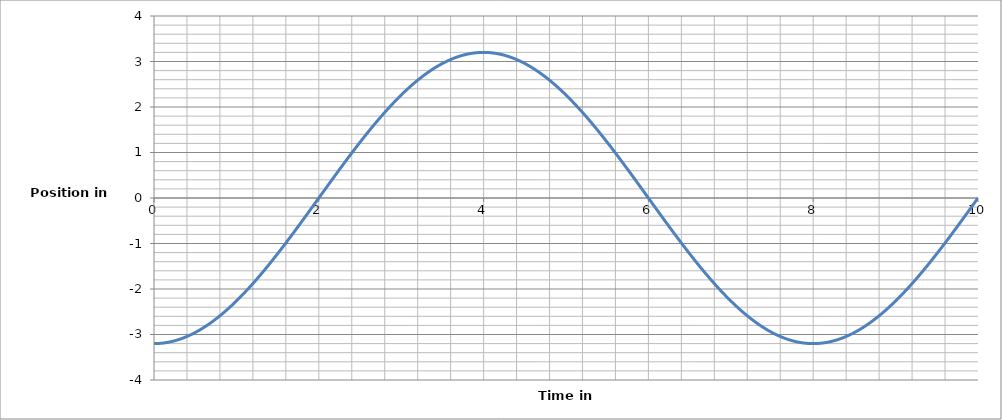
| Category | Series 0 |
|---|---|
| 0.0 | -3.2 |
| 0.01 | -3.2 |
| 0.02 | -3.2 |
| 0.03 | -3.199 |
| 0.04 | -3.198 |
| 0.05 | -3.198 |
| 0.06 | -3.196 |
| 0.07 | -3.195 |
| 0.08 | -3.194 |
| 0.09 | -3.192 |
| 0.1 | -3.19 |
| 0.11 | -3.188 |
| 0.12 | -3.186 |
| 0.13 | -3.183 |
| 0.14 | -3.181 |
| 0.15 | -3.178 |
| 0.16 | -3.175 |
| 0.17 | -3.172 |
| 0.18 | -3.168 |
| 0.19 | -3.164 |
| 0.2 | -3.161 |
| 0.21 | -3.157 |
| 0.22 | -3.152 |
| 0.23 | -3.148 |
| 0.24 | -3.143 |
| 0.25 | -3.139 |
| 0.26 | -3.134 |
| 0.27 | -3.128 |
| 0.28 | -3.123 |
| 0.29 | -3.117 |
| 0.3 | -3.112 |
| 0.31 | -3.106 |
| 0.32 | -3.099 |
| 0.33 | -3.093 |
| 0.34 | -3.087 |
| 0.35 | -3.08 |
| 0.36 | -3.073 |
| 0.37 | -3.066 |
| 0.38 | -3.059 |
| 0.39 | -3.051 |
| 0.4 | -3.043 |
| 0.41 | -3.036 |
| 0.42 | -3.027 |
| 0.43 | -3.019 |
| 0.44 | -3.011 |
| 0.45 | -3.002 |
| 0.46 | -2.993 |
| 0.47 | -2.984 |
| 0.48 | -2.975 |
| 0.49 | -2.966 |
| 0.5 | -2.956 |
| 0.51 | -2.947 |
| 0.52 | -2.937 |
| 0.53 | -2.927 |
| 0.54 | -2.916 |
| 0.55 | -2.906 |
| 0.56 | -2.895 |
| 0.57 | -2.885 |
| 0.58 | -2.874 |
| 0.59 | -2.863 |
| 0.6 | -2.851 |
| 0.61 | -2.84 |
| 0.62 | -2.828 |
| 0.63 | -2.816 |
| 0.64 | -2.804 |
| 0.65 | -2.792 |
| 0.66 | -2.78 |
| 0.67 | -2.767 |
| 0.68 | -2.754 |
| 0.69 | -2.741 |
| 0.7 | -2.728 |
| 0.71 | -2.715 |
| 0.72 | -2.702 |
| 0.73 | -2.688 |
| 0.74 | -2.675 |
| 0.75 | -2.661 |
| 0.76 | -2.647 |
| 0.77 | -2.632 |
| 0.78 | -2.618 |
| 0.79 | -2.604 |
| 0.8 | -2.589 |
| 0.81 | -2.574 |
| 0.82 | -2.559 |
| 0.83 | -2.544 |
| 0.84 | -2.528 |
| 0.85 | -2.513 |
| 0.86 | -2.497 |
| 0.87 | -2.482 |
| 0.88 | -2.466 |
| 0.89 | -2.45 |
| 0.9 | -2.433 |
| 0.91 | -2.417 |
| 0.92 | -2.4 |
| 0.93 | -2.384 |
| 0.94 | -2.367 |
| 0.95 | -2.35 |
| 0.96 | -2.333 |
| 0.97 | -2.315 |
| 0.98 | -2.298 |
| 0.99 | -2.28 |
| 1.0 | -2.263 |
| 1.01 | -2.245 |
| 1.02 | -2.227 |
| 1.03 | -2.209 |
| 1.04 | -2.191 |
| 1.05 | -2.172 |
| 1.06 | -2.154 |
| 1.07 | -2.135 |
| 1.08 | -2.116 |
| 1.09 | -2.097 |
| 1.1 | -2.078 |
| 1.11 | -2.059 |
| 1.12 | -2.04 |
| 1.13 | -2.02 |
| 1.14 | -2.001 |
| 1.15 | -1.981 |
| 1.16 | -1.961 |
| 1.17 | -1.941 |
| 1.18 | -1.921 |
| 1.19 | -1.901 |
| 1.2 | -1.881 |
| 1.21 | -1.861 |
| 1.22 | -1.84 |
| 1.23 | -1.819 |
| 1.24 | -1.799 |
| 1.25 | -1.778 |
| 1.26 | -1.757 |
| 1.27 | -1.736 |
| 1.28 | -1.715 |
| 1.29 | -1.693 |
| 1.3 | -1.672 |
| 1.31 | -1.651 |
| 1.32 | -1.629 |
| 1.33 | -1.607 |
| 1.34 | -1.585 |
| 1.35 | -1.564 |
| 1.36 | -1.542 |
| 1.37 | -1.52 |
| 1.38 | -1.497 |
| 1.39 | -1.475 |
| 1.4 | -1.453 |
| 1.41 | -1.43 |
| 1.42 | -1.408 |
| 1.43 | -1.385 |
| 1.44 | -1.362 |
| 1.45 | -1.34 |
| 1.46 | -1.317 |
| 1.47 | -1.294 |
| 1.48 | -1.271 |
| 1.49 | -1.248 |
| 1.5 | -1.225 |
| 1.51 | -1.201 |
| 1.52 | -1.178 |
| 1.53 | -1.155 |
| 1.54 | -1.131 |
| 1.55 | -1.108 |
| 1.56 | -1.084 |
| 1.57 | -1.06 |
| 1.58 | -1.037 |
| 1.59 | -1.013 |
| 1.6 | -0.989 |
| 1.61 | -0.965 |
| 1.62 | -0.941 |
| 1.63 | -0.917 |
| 1.64 | -0.893 |
| 1.65 | -0.869 |
| 1.66 | -0.844 |
| 1.67 | -0.82 |
| 1.68 | -0.796 |
| 1.69 | -0.771 |
| 1.7 | -0.747 |
| 1.71 | -0.723 |
| 1.72 | -0.698 |
| 1.73 | -0.674 |
| 1.74 | -0.649 |
| 1.75 | -0.624 |
| 1.76 | -0.6 |
| 1.77 | -0.575 |
| 1.78 | -0.55 |
| 1.79 | -0.525 |
| 1.8 | -0.501 |
| 1.81 | -0.476 |
| 1.82 | -0.451 |
| 1.83 | -0.426 |
| 1.84 | -0.401 |
| 1.85 | -0.376 |
| 1.86 | -0.351 |
| 1.87 | -0.326 |
| 1.88 | -0.301 |
| 1.89 | -0.276 |
| 1.9 | -0.251 |
| 1.91 | -0.226 |
| 1.92 | -0.201 |
| 1.93 | -0.176 |
| 1.94 | -0.151 |
| 1.95 | -0.126 |
| 1.96 | -0.101 |
| 1.97 | -0.075 |
| 1.98 | -0.05 |
| 1.99 | -0.025 |
| 2.0 | 0 |
| 2.01 | 0.025 |
| 2.02 | 0.05 |
| 2.03 | 0.075 |
| 2.04 | 0.101 |
| 2.05 | 0.126 |
| 2.06 | 0.151 |
| 2.07 | 0.176 |
| 2.08 | 0.201 |
| 2.09 | 0.226 |
| 2.1 | 0.251 |
| 2.11 | 0.276 |
| 2.12 | 0.301 |
| 2.13 | 0.326 |
| 2.14 | 0.351 |
| 2.15 | 0.376 |
| 2.16 | 0.401 |
| 2.17 | 0.426 |
| 2.18 | 0.451 |
| 2.19 | 0.476 |
| 2.2 | 0.501 |
| 2.21 | 0.525 |
| 2.22 | 0.55 |
| 2.23 | 0.575 |
| 2.24 | 0.6 |
| 2.25 | 0.624 |
| 2.26 | 0.649 |
| 2.27 | 0.674 |
| 2.28 | 0.698 |
| 2.29 | 0.723 |
| 2.3 | 0.747 |
| 2.31 | 0.771 |
| 2.32 | 0.796 |
| 2.33 | 0.82 |
| 2.34 | 0.844 |
| 2.35 | 0.869 |
| 2.36 | 0.893 |
| 2.37 | 0.917 |
| 2.38 | 0.941 |
| 2.39 | 0.965 |
| 2.4 | 0.989 |
| 2.41 | 1.013 |
| 2.42 | 1.037 |
| 2.43 | 1.06 |
| 2.44 | 1.084 |
| 2.45 | 1.108 |
| 2.46 | 1.131 |
| 2.47 | 1.155 |
| 2.48 | 1.178 |
| 2.49 | 1.201 |
| 2.5 | 1.225 |
| 2.51 | 1.248 |
| 2.52 | 1.271 |
| 2.53 | 1.294 |
| 2.54 | 1.317 |
| 2.55 | 1.34 |
| 2.56 | 1.362 |
| 2.57 | 1.385 |
| 2.58 | 1.408 |
| 2.59 | 1.43 |
| 2.6 | 1.453 |
| 2.61 | 1.475 |
| 2.62 | 1.497 |
| 2.63 | 1.52 |
| 2.64 | 1.542 |
| 2.65 | 1.564 |
| 2.66 | 1.585 |
| 2.67 | 1.607 |
| 2.68 | 1.629 |
| 2.69 | 1.651 |
| 2.7 | 1.672 |
| 2.71 | 1.693 |
| 2.72 | 1.715 |
| 2.73 | 1.736 |
| 2.74 | 1.757 |
| 2.75 | 1.778 |
| 2.76 | 1.799 |
| 2.77 | 1.819 |
| 2.78 | 1.84 |
| 2.79 | 1.861 |
| 2.8 | 1.881 |
| 2.81 | 1.901 |
| 2.82 | 1.921 |
| 2.83 | 1.941 |
| 2.84 | 1.961 |
| 2.85 | 1.981 |
| 2.86 | 2.001 |
| 2.87 | 2.02 |
| 2.88 | 2.04 |
| 2.89 | 2.059 |
| 2.9 | 2.078 |
| 2.91 | 2.097 |
| 2.92 | 2.116 |
| 2.93 | 2.135 |
| 2.94 | 2.154 |
| 2.95 | 2.172 |
| 2.96 | 2.191 |
| 2.97 | 2.209 |
| 2.98 | 2.227 |
| 2.99 | 2.245 |
| 3.0 | 2.263 |
| 3.01 | 2.28 |
| 3.02 | 2.298 |
| 3.03 | 2.315 |
| 3.04 | 2.333 |
| 3.05 | 2.35 |
| 3.06 | 2.367 |
| 3.07 | 2.384 |
| 3.08 | 2.4 |
| 3.09 | 2.417 |
| 3.1 | 2.433 |
| 3.11 | 2.45 |
| 3.12 | 2.466 |
| 3.13 | 2.482 |
| 3.14 | 2.497 |
| 3.15 | 2.513 |
| 3.16 | 2.528 |
| 3.17 | 2.544 |
| 3.18 | 2.559 |
| 3.19 | 2.574 |
| 3.2 | 2.589 |
| 3.21 | 2.604 |
| 3.22 | 2.618 |
| 3.23 | 2.632 |
| 3.24 | 2.647 |
| 3.25 | 2.661 |
| 3.26 | 2.675 |
| 3.27 | 2.688 |
| 3.28 | 2.702 |
| 3.29 | 2.715 |
| 3.3 | 2.728 |
| 3.31 | 2.741 |
| 3.32 | 2.754 |
| 3.33 | 2.767 |
| 3.34 | 2.78 |
| 3.35 | 2.792 |
| 3.36 | 2.804 |
| 3.37 | 2.816 |
| 3.38 | 2.828 |
| 3.39 | 2.84 |
| 3.4 | 2.851 |
| 3.41 | 2.863 |
| 3.42 | 2.874 |
| 3.43 | 2.885 |
| 3.44 | 2.895 |
| 3.45 | 2.906 |
| 3.46 | 2.916 |
| 3.47 | 2.927 |
| 3.48 | 2.937 |
| 3.49 | 2.947 |
| 3.5 | 2.956 |
| 3.51 | 2.966 |
| 3.52 | 2.975 |
| 3.53 | 2.984 |
| 3.54 | 2.993 |
| 3.55 | 3.002 |
| 3.56 | 3.011 |
| 3.57 | 3.019 |
| 3.58 | 3.027 |
| 3.59 | 3.036 |
| 3.6 | 3.043 |
| 3.61 | 3.051 |
| 3.62 | 3.059 |
| 3.63 | 3.066 |
| 3.64 | 3.073 |
| 3.65 | 3.08 |
| 3.66 | 3.087 |
| 3.67 | 3.093 |
| 3.68 | 3.099 |
| 3.69 | 3.106 |
| 3.7 | 3.112 |
| 3.71 | 3.117 |
| 3.72 | 3.123 |
| 3.73 | 3.128 |
| 3.74 | 3.134 |
| 3.75 | 3.139 |
| 3.76 | 3.143 |
| 3.77 | 3.148 |
| 3.78 | 3.152 |
| 3.79 | 3.157 |
| 3.8 | 3.161 |
| 3.81 | 3.164 |
| 3.82 | 3.168 |
| 3.83 | 3.172 |
| 3.84 | 3.175 |
| 3.85 | 3.178 |
| 3.86 | 3.181 |
| 3.87 | 3.183 |
| 3.88 | 3.186 |
| 3.89 | 3.188 |
| 3.9 | 3.19 |
| 3.91 | 3.192 |
| 3.92 | 3.194 |
| 3.93 | 3.195 |
| 3.94 | 3.196 |
| 3.95 | 3.198 |
| 3.96 | 3.198 |
| 3.97 | 3.199 |
| 3.98 | 3.2 |
| 3.99 | 3.2 |
| 4.0 | 3.2 |
| 4.01 | 3.2 |
| 4.02 | 3.2 |
| 4.03 | 3.199 |
| 4.04 | 3.198 |
| 4.05 | 3.198 |
| 4.06 | 3.196 |
| 4.07 | 3.195 |
| 4.08 | 3.194 |
| 4.09 | 3.192 |
| 4.1 | 3.19 |
| 4.11 | 3.188 |
| 4.12 | 3.186 |
| 4.13 | 3.183 |
| 4.14 | 3.181 |
| 4.15 | 3.178 |
| 4.16 | 3.175 |
| 4.17 | 3.172 |
| 4.18 | 3.168 |
| 4.19 | 3.164 |
| 4.2 | 3.161 |
| 4.21 | 3.157 |
| 4.22 | 3.152 |
| 4.23 | 3.148 |
| 4.24 | 3.143 |
| 4.25 | 3.139 |
| 4.26 | 3.134 |
| 4.27 | 3.128 |
| 4.28 | 3.123 |
| 4.29 | 3.117 |
| 4.3 | 3.112 |
| 4.31 | 3.106 |
| 4.32 | 3.099 |
| 4.33 | 3.093 |
| 4.34 | 3.087 |
| 4.35 | 3.08 |
| 4.36 | 3.073 |
| 4.37 | 3.066 |
| 4.38 | 3.059 |
| 4.39 | 3.051 |
| 4.4 | 3.043 |
| 4.41 | 3.036 |
| 4.42 | 3.027 |
| 4.43 | 3.019 |
| 4.44 | 3.011 |
| 4.45 | 3.002 |
| 4.46 | 2.993 |
| 4.47 | 2.984 |
| 4.48 | 2.975 |
| 4.49 | 2.966 |
| 4.5 | 2.956 |
| 4.51 | 2.947 |
| 4.52 | 2.937 |
| 4.53 | 2.927 |
| 4.54 | 2.916 |
| 4.55 | 2.906 |
| 4.56 | 2.895 |
| 4.57 | 2.885 |
| 4.58 | 2.874 |
| 4.59 | 2.863 |
| 4.6 | 2.851 |
| 4.61 | 2.84 |
| 4.62 | 2.828 |
| 4.63 | 2.816 |
| 4.64 | 2.804 |
| 4.65 | 2.792 |
| 4.66 | 2.78 |
| 4.67 | 2.767 |
| 4.68 | 2.754 |
| 4.69 | 2.741 |
| 4.7 | 2.728 |
| 4.71 | 2.715 |
| 4.72 | 2.702 |
| 4.73 | 2.688 |
| 4.74 | 2.675 |
| 4.75 | 2.661 |
| 4.76 | 2.647 |
| 4.77 | 2.632 |
| 4.78 | 2.618 |
| 4.79 | 2.604 |
| 4.8 | 2.589 |
| 4.81 | 2.574 |
| 4.82 | 2.559 |
| 4.83 | 2.544 |
| 4.84 | 2.528 |
| 4.85 | 2.513 |
| 4.86 | 2.497 |
| 4.87 | 2.482 |
| 4.88 | 2.466 |
| 4.89 | 2.45 |
| 4.9 | 2.433 |
| 4.91 | 2.417 |
| 4.92 | 2.4 |
| 4.93 | 2.384 |
| 4.94 | 2.367 |
| 4.95 | 2.35 |
| 4.96 | 2.333 |
| 4.97 | 2.315 |
| 4.98 | 2.298 |
| 4.99 | 2.28 |
| 5.0 | 2.263 |
| 5.01 | 2.245 |
| 5.02 | 2.227 |
| 5.03 | 2.209 |
| 5.04 | 2.191 |
| 5.05 | 2.172 |
| 5.06 | 2.154 |
| 5.07 | 2.135 |
| 5.08 | 2.116 |
| 5.09 | 2.097 |
| 5.1 | 2.078 |
| 5.11 | 2.059 |
| 5.12 | 2.04 |
| 5.13 | 2.02 |
| 5.14 | 2.001 |
| 5.15 | 1.981 |
| 5.16 | 1.961 |
| 5.17 | 1.941 |
| 5.18 | 1.921 |
| 5.19 | 1.901 |
| 5.2 | 1.881 |
| 5.21 | 1.861 |
| 5.22 | 1.84 |
| 5.23 | 1.819 |
| 5.24 | 1.799 |
| 5.25 | 1.778 |
| 5.26 | 1.757 |
| 5.27 | 1.736 |
| 5.28 | 1.715 |
| 5.29 | 1.693 |
| 5.3 | 1.672 |
| 5.31 | 1.651 |
| 5.32 | 1.629 |
| 5.33 | 1.607 |
| 5.34 | 1.585 |
| 5.35 | 1.564 |
| 5.36 | 1.542 |
| 5.37 | 1.52 |
| 5.38 | 1.497 |
| 5.39 | 1.475 |
| 5.4 | 1.453 |
| 5.41 | 1.43 |
| 5.42 | 1.408 |
| 5.43 | 1.385 |
| 5.44 | 1.362 |
| 5.45 | 1.34 |
| 5.46 | 1.317 |
| 5.47 | 1.294 |
| 5.48 | 1.271 |
| 5.49 | 1.248 |
| 5.5 | 1.225 |
| 5.51 | 1.201 |
| 5.52 | 1.178 |
| 5.53 | 1.155 |
| 5.54 | 1.131 |
| 5.55 | 1.108 |
| 5.56 | 1.084 |
| 5.57 | 1.06 |
| 5.58 | 1.037 |
| 5.59 | 1.013 |
| 5.6 | 0.989 |
| 5.61 | 0.965 |
| 5.62 | 0.941 |
| 5.63 | 0.917 |
| 5.64 | 0.893 |
| 5.65 | 0.869 |
| 5.66 | 0.844 |
| 5.67 | 0.82 |
| 5.68 | 0.796 |
| 5.69 | 0.771 |
| 5.7 | 0.747 |
| 5.71 | 0.723 |
| 5.72 | 0.698 |
| 5.73 | 0.674 |
| 5.74 | 0.649 |
| 5.75 | 0.624 |
| 5.76 | 0.6 |
| 5.77 | 0.575 |
| 5.78 | 0.55 |
| 5.79 | 0.525 |
| 5.8 | 0.501 |
| 5.81 | 0.476 |
| 5.82 | 0.451 |
| 5.83 | 0.426 |
| 5.84 | 0.401 |
| 5.85 | 0.376 |
| 5.86 | 0.351 |
| 5.87 | 0.326 |
| 5.88 | 0.301 |
| 5.89 | 0.276 |
| 5.9 | 0.251 |
| 5.91 | 0.226 |
| 5.92 | 0.201 |
| 5.93 | 0.176 |
| 5.94 | 0.151 |
| 5.95 | 0.126 |
| 5.96 | 0.101 |
| 5.97 | 0.075 |
| 5.98 | 0.05 |
| 5.99 | 0.025 |
| 6.0 | 0 |
| 6.01 | -0.025 |
| 6.02 | -0.05 |
| 6.03 | -0.075 |
| 6.04 | -0.101 |
| 6.05 | -0.126 |
| 6.06 | -0.151 |
| 6.07 | -0.176 |
| 6.08 | -0.201 |
| 6.09 | -0.226 |
| 6.1 | -0.251 |
| 6.11 | -0.276 |
| 6.12 | -0.301 |
| 6.13 | -0.326 |
| 6.14 | -0.351 |
| 6.15 | -0.376 |
| 6.16 | -0.401 |
| 6.17 | -0.426 |
| 6.18 | -0.451 |
| 6.19 | -0.476 |
| 6.2 | -0.501 |
| 6.21 | -0.525 |
| 6.22 | -0.55 |
| 6.23 | -0.575 |
| 6.24 | -0.6 |
| 6.25 | -0.624 |
| 6.26 | -0.649 |
| 6.27 | -0.674 |
| 6.28 | -0.698 |
| 6.29 | -0.723 |
| 6.3 | -0.747 |
| 6.31 | -0.771 |
| 6.32 | -0.796 |
| 6.33 | -0.82 |
| 6.34 | -0.844 |
| 6.35 | -0.869 |
| 6.36 | -0.893 |
| 6.37 | -0.917 |
| 6.38 | -0.941 |
| 6.39 | -0.965 |
| 6.4 | -0.989 |
| 6.41 | -1.013 |
| 6.42 | -1.037 |
| 6.43 | -1.06 |
| 6.44 | -1.084 |
| 6.45 | -1.108 |
| 6.46 | -1.131 |
| 6.47 | -1.155 |
| 6.48 | -1.178 |
| 6.49 | -1.201 |
| 6.5 | -1.225 |
| 6.51 | -1.248 |
| 6.52 | -1.271 |
| 6.53 | -1.294 |
| 6.54 | -1.317 |
| 6.55 | -1.34 |
| 6.56 | -1.362 |
| 6.57 | -1.385 |
| 6.58 | -1.408 |
| 6.59 | -1.43 |
| 6.6 | -1.453 |
| 6.61 | -1.475 |
| 6.62 | -1.497 |
| 6.63 | -1.52 |
| 6.64 | -1.542 |
| 6.65 | -1.564 |
| 6.66 | -1.585 |
| 6.67 | -1.607 |
| 6.68 | -1.629 |
| 6.69 | -1.651 |
| 6.7 | -1.672 |
| 6.71 | -1.693 |
| 6.72 | -1.715 |
| 6.73 | -1.736 |
| 6.74 | -1.757 |
| 6.75 | -1.778 |
| 6.76 | -1.799 |
| 6.77 | -1.819 |
| 6.78 | -1.84 |
| 6.79 | -1.861 |
| 6.8 | -1.881 |
| 6.81 | -1.901 |
| 6.82 | -1.921 |
| 6.83 | -1.941 |
| 6.84 | -1.961 |
| 6.85 | -1.981 |
| 6.86 | -2.001 |
| 6.87 | -2.02 |
| 6.88 | -2.04 |
| 6.89 | -2.059 |
| 6.9 | -2.078 |
| 6.91 | -2.097 |
| 6.92 | -2.116 |
| 6.93 | -2.135 |
| 6.94 | -2.154 |
| 6.95 | -2.172 |
| 6.96 | -2.191 |
| 6.97 | -2.209 |
| 6.98 | -2.227 |
| 6.99 | -2.245 |
| 7.0 | -2.263 |
| 7.01 | -2.28 |
| 7.02 | -2.298 |
| 7.03 | -2.315 |
| 7.04 | -2.333 |
| 7.05 | -2.35 |
| 7.06 | -2.367 |
| 7.07 | -2.384 |
| 7.08 | -2.4 |
| 7.09 | -2.417 |
| 7.1 | -2.433 |
| 7.11 | -2.45 |
| 7.12 | -2.466 |
| 7.13 | -2.482 |
| 7.14 | -2.497 |
| 7.15 | -2.513 |
| 7.16 | -2.528 |
| 7.17 | -2.544 |
| 7.18 | -2.559 |
| 7.19 | -2.574 |
| 7.2 | -2.589 |
| 7.21 | -2.604 |
| 7.22 | -2.618 |
| 7.23 | -2.632 |
| 7.24 | -2.647 |
| 7.25 | -2.661 |
| 7.26 | -2.675 |
| 7.27 | -2.688 |
| 7.28 | -2.702 |
| 7.29 | -2.715 |
| 7.3 | -2.728 |
| 7.31 | -2.741 |
| 7.32 | -2.754 |
| 7.33 | -2.767 |
| 7.34 | -2.78 |
| 7.35 | -2.792 |
| 7.36 | -2.804 |
| 7.37 | -2.816 |
| 7.38 | -2.828 |
| 7.39 | -2.84 |
| 7.4 | -2.851 |
| 7.41 | -2.863 |
| 7.42 | -2.874 |
| 7.43 | -2.885 |
| 7.44 | -2.895 |
| 7.45 | -2.906 |
| 7.46 | -2.916 |
| 7.47 | -2.927 |
| 7.48 | -2.937 |
| 7.49 | -2.947 |
| 7.5 | -2.956 |
| 7.51 | -2.966 |
| 7.52 | -2.975 |
| 7.53 | -2.984 |
| 7.54 | -2.993 |
| 7.55 | -3.002 |
| 7.56 | -3.011 |
| 7.57 | -3.019 |
| 7.58 | -3.027 |
| 7.59 | -3.036 |
| 7.6 | -3.043 |
| 7.61 | -3.051 |
| 7.62 | -3.059 |
| 7.63 | -3.066 |
| 7.64 | -3.073 |
| 7.65 | -3.08 |
| 7.66 | -3.087 |
| 7.67 | -3.093 |
| 7.68 | -3.099 |
| 7.69 | -3.106 |
| 7.7 | -3.112 |
| 7.71 | -3.117 |
| 7.72 | -3.123 |
| 7.73 | -3.128 |
| 7.74 | -3.134 |
| 7.75 | -3.139 |
| 7.76 | -3.143 |
| 7.77 | -3.148 |
| 7.78 | -3.152 |
| 7.79 | -3.157 |
| 7.8 | -3.161 |
| 7.81 | -3.164 |
| 7.82 | -3.168 |
| 7.83 | -3.172 |
| 7.84 | -3.175 |
| 7.85 | -3.178 |
| 7.86 | -3.181 |
| 7.87 | -3.183 |
| 7.88 | -3.186 |
| 7.89 | -3.188 |
| 7.9 | -3.19 |
| 7.91 | -3.192 |
| 7.92 | -3.194 |
| 7.93 | -3.195 |
| 7.94 | -3.196 |
| 7.95 | -3.198 |
| 7.96 | -3.198 |
| 7.97 | -3.199 |
| 7.98 | -3.2 |
| 7.99 | -3.2 |
| 8.0 | -3.2 |
| 8.01 | -3.2 |
| 8.02 | -3.2 |
| 8.03 | -3.199 |
| 8.04 | -3.198 |
| 8.05 | -3.198 |
| 8.06 | -3.196 |
| 8.07 | -3.195 |
| 8.08 | -3.194 |
| 8.09 | -3.192 |
| 8.1 | -3.19 |
| 8.11 | -3.188 |
| 8.12 | -3.186 |
| 8.13 | -3.183 |
| 8.14 | -3.181 |
| 8.15 | -3.178 |
| 8.16 | -3.175 |
| 8.17 | -3.172 |
| 8.18 | -3.168 |
| 8.19 | -3.164 |
| 8.2 | -3.161 |
| 8.21 | -3.157 |
| 8.22 | -3.152 |
| 8.23 | -3.148 |
| 8.24 | -3.143 |
| 8.25 | -3.139 |
| 8.26 | -3.134 |
| 8.27 | -3.128 |
| 8.28 | -3.123 |
| 8.29 | -3.117 |
| 8.3 | -3.112 |
| 8.31 | -3.106 |
| 8.32 | -3.099 |
| 8.33 | -3.093 |
| 8.34 | -3.087 |
| 8.35 | -3.08 |
| 8.36 | -3.073 |
| 8.37 | -3.066 |
| 8.38 | -3.059 |
| 8.39 | -3.051 |
| 8.4 | -3.043 |
| 8.41 | -3.036 |
| 8.42 | -3.027 |
| 8.43 | -3.019 |
| 8.44 | -3.011 |
| 8.45 | -3.002 |
| 8.46 | -2.993 |
| 8.47 | -2.984 |
| 8.48 | -2.975 |
| 8.49 | -2.966 |
| 8.5 | -2.956 |
| 8.51 | -2.947 |
| 8.52 | -2.937 |
| 8.53 | -2.927 |
| 8.54 | -2.916 |
| 8.55 | -2.906 |
| 8.56 | -2.895 |
| 8.57 | -2.885 |
| 8.58 | -2.874 |
| 8.59 | -2.863 |
| 8.6 | -2.851 |
| 8.61 | -2.84 |
| 8.62 | -2.828 |
| 8.63 | -2.816 |
| 8.64 | -2.804 |
| 8.65 | -2.792 |
| 8.66 | -2.78 |
| 8.67 | -2.767 |
| 8.68 | -2.754 |
| 8.69 | -2.741 |
| 8.7 | -2.728 |
| 8.71 | -2.715 |
| 8.72 | -2.702 |
| 8.73 | -2.688 |
| 8.74 | -2.675 |
| 8.75 | -2.661 |
| 8.76 | -2.647 |
| 8.77 | -2.632 |
| 8.78 | -2.618 |
| 8.79 | -2.604 |
| 8.8 | -2.589 |
| 8.81 | -2.574 |
| 8.82 | -2.559 |
| 8.83 | -2.544 |
| 8.84 | -2.528 |
| 8.85 | -2.513 |
| 8.86 | -2.497 |
| 8.87 | -2.482 |
| 8.88 | -2.466 |
| 8.89 | -2.45 |
| 8.9 | -2.433 |
| 8.91 | -2.417 |
| 8.92 | -2.4 |
| 8.93 | -2.384 |
| 8.94 | -2.367 |
| 8.95 | -2.35 |
| 8.96 | -2.333 |
| 8.97 | -2.315 |
| 8.98 | -2.298 |
| 8.99 | -2.28 |
| 9.0 | -2.263 |
| 9.01 | -2.245 |
| 9.02 | -2.227 |
| 9.03 | -2.209 |
| 9.04 | -2.191 |
| 9.05 | -2.172 |
| 9.06 | -2.154 |
| 9.07 | -2.135 |
| 9.08 | -2.116 |
| 9.09 | -2.097 |
| 9.1 | -2.078 |
| 9.11 | -2.059 |
| 9.12 | -2.04 |
| 9.13 | -2.02 |
| 9.14 | -2.001 |
| 9.15 | -1.981 |
| 9.16 | -1.961 |
| 9.17 | -1.941 |
| 9.18 | -1.921 |
| 9.19 | -1.901 |
| 9.2 | -1.881 |
| 9.21 | -1.861 |
| 9.22 | -1.84 |
| 9.23 | -1.819 |
| 9.24 | -1.799 |
| 9.25 | -1.778 |
| 9.26 | -1.757 |
| 9.27 | -1.736 |
| 9.28 | -1.715 |
| 9.29 | -1.693 |
| 9.3 | -1.672 |
| 9.31 | -1.651 |
| 9.32 | -1.629 |
| 9.33 | -1.607 |
| 9.34 | -1.585 |
| 9.35 | -1.564 |
| 9.36 | -1.542 |
| 9.37 | -1.52 |
| 9.38 | -1.497 |
| 9.39 | -1.475 |
| 9.4 | -1.453 |
| 9.41 | -1.43 |
| 9.42 | -1.408 |
| 9.43 | -1.385 |
| 9.44 | -1.362 |
| 9.45 | -1.34 |
| 9.46 | -1.317 |
| 9.47 | -1.294 |
| 9.48 | -1.271 |
| 9.49 | -1.248 |
| 9.5 | -1.225 |
| 9.51 | -1.201 |
| 9.52 | -1.178 |
| 9.53 | -1.155 |
| 9.54 | -1.131 |
| 9.55 | -1.108 |
| 9.56 | -1.084 |
| 9.57 | -1.06 |
| 9.58 | -1.037 |
| 9.59 | -1.013 |
| 9.6 | -0.989 |
| 9.61 | -0.965 |
| 9.62 | -0.941 |
| 9.63 | -0.917 |
| 9.64 | -0.893 |
| 9.65 | -0.869 |
| 9.66 | -0.844 |
| 9.67 | -0.82 |
| 9.68 | -0.796 |
| 9.69 | -0.771 |
| 9.7 | -0.747 |
| 9.71 | -0.723 |
| 9.72 | -0.698 |
| 9.73 | -0.674 |
| 9.74 | -0.649 |
| 9.75 | -0.624 |
| 9.76 | -0.6 |
| 9.77 | -0.575 |
| 9.78 | -0.55 |
| 9.79 | -0.525 |
| 9.8 | -0.501 |
| 9.81 | -0.476 |
| 9.82 | -0.451 |
| 9.83 | -0.426 |
| 9.84 | -0.401 |
| 9.85 | -0.376 |
| 9.86 | -0.351 |
| 9.87 | -0.326 |
| 9.88 | -0.301 |
| 9.89 | -0.276 |
| 9.9 | -0.251 |
| 9.91 | -0.226 |
| 9.92 | -0.201 |
| 9.93 | -0.176 |
| 9.94 | -0.151 |
| 9.95 | -0.126 |
| 9.96 | -0.101 |
| 9.97 | -0.075 |
| 9.98 | -0.05 |
| 9.99 | -0.025 |
| 10.0 | 0 |